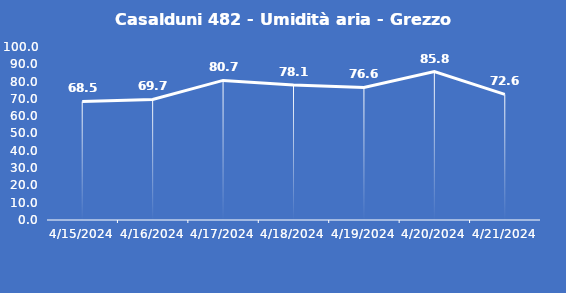
| Category | Casalduni 482 - Umidità aria - Grezzo (%) |
|---|---|
| 4/15/24 | 68.5 |
| 4/16/24 | 69.7 |
| 4/17/24 | 80.7 |
| 4/18/24 | 78.1 |
| 4/19/24 | 76.6 |
| 4/20/24 | 85.8 |
| 4/21/24 | 72.6 |